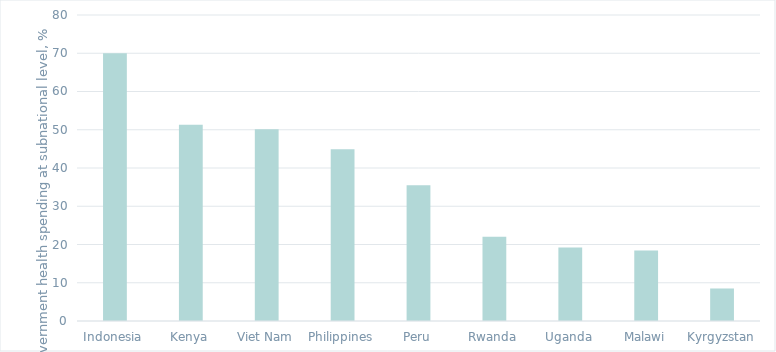
| Category | % government health spending at subnational level |
|---|---|
| Indonesia | 70 |
| Kenya | 51.3 |
| Viet Nam | 50.1 |
| Philippines | 44.9 |
| Peru | 35.5 |
| Rwanda | 22 |
| Uganda | 19.2 |
| Malawi | 18.4 |
| Kyrgyzstan | 8.5 |